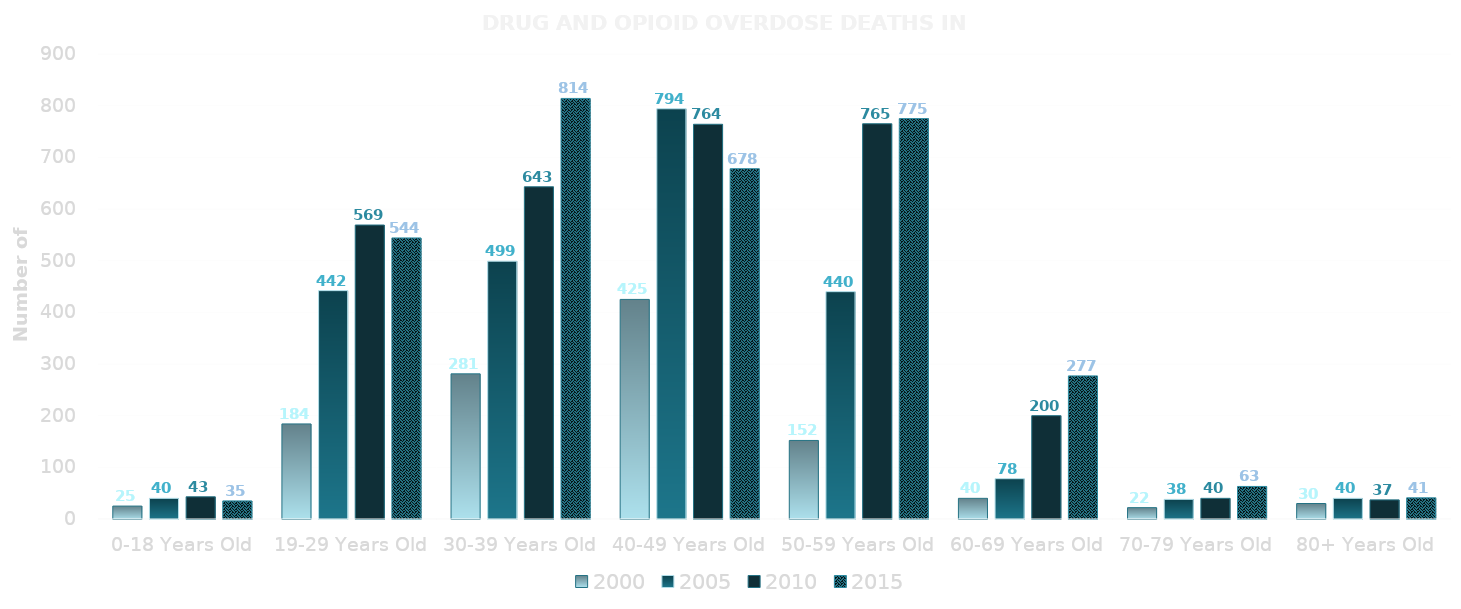
| Category | 2000 | 2005 | 2010 | 2015 |
|---|---|---|---|---|
| 0-18 Years Old | 25 | 40 | 43 | 35 |
| 19-29 Years Old | 184 | 442 | 569 | 544 |
| 30-39 Years Old | 281 | 499 | 643 | 814 |
| 40-49 Years Old | 425 | 794 | 764 | 678 |
| 50-59 Years Old | 152 | 440 | 765 | 775 |
| 60-69 Years Old | 40 | 78 | 200 | 277 |
| 70-79 Years Old | 22 | 38 | 40 | 63 |
| 80+ Years Old | 30 | 40 | 37 | 41 |